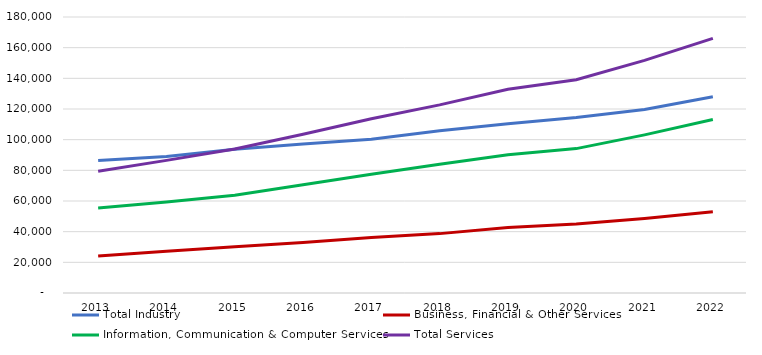
| Category | Total Industry | Business, Financial & Other Services | Information, Communication & Computer Services | Total Services |
|---|---|---|---|---|
| 2013 | 86382 | 24061 | 55396 | 79457 |
| 2014 | 88949 | 27202 | 59300 | 86502 |
| 2015 | 93806 | 30171 | 63692 | 93863 |
| 2016 | 97222 | 32971 | 70615 | 103586 |
| 2017 | 100241 | 36249 | 77405 | 113654 |
| 2018 | 105748 | 38726 | 83976 | 122702 |
| 2019 | 110441 | 42704 | 90111 | 132815 |
| 2020 | 114526 | 44932 | 94170 | 139102 |
| 2021 | 119648 | 48600 | 103140 | 151740 |
| 2022 | 127980 | 52988 | 113104 | 166092 |